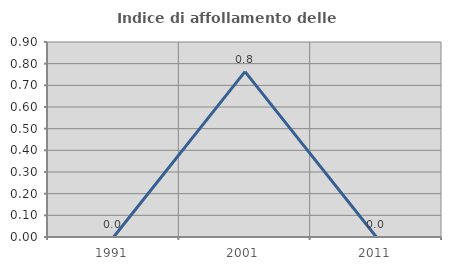
| Category | Indice di affollamento delle abitazioni  |
|---|---|
| 1991.0 | 0 |
| 2001.0 | 0.763 |
| 2011.0 | 0 |